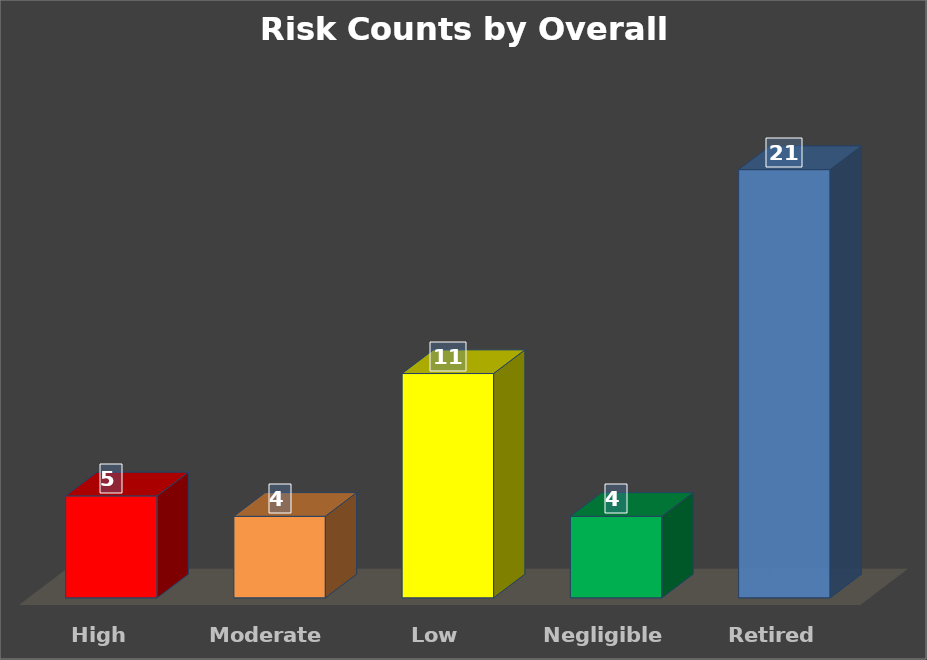
| Category | Post-Mitigation |
|---|---|
| High | 5 |
| Moderate | 4 |
| Low | 11 |
| Negligible | 4 |
| Retired | 21 |